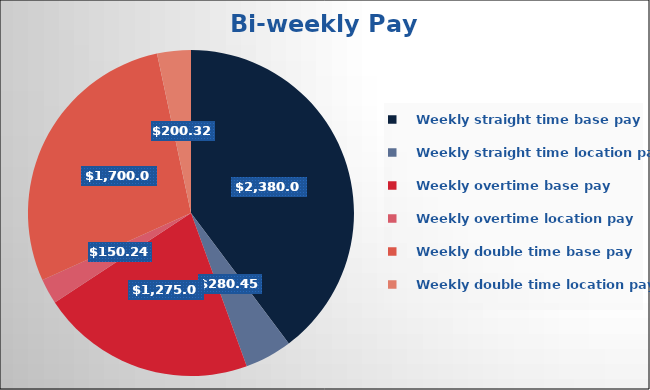
| Category | Series 0 |
|---|---|
|    Weekly straight time base pay | 2380 |
|    Weekly straight time location pay  | 280.449 |
|    Weekly overtime base pay | 1275 |
|    Weekly overtime location pay | 150.24 |
|    Weekly double time base pay | 1700 |
|    Weekly double time location pay | 200.321 |